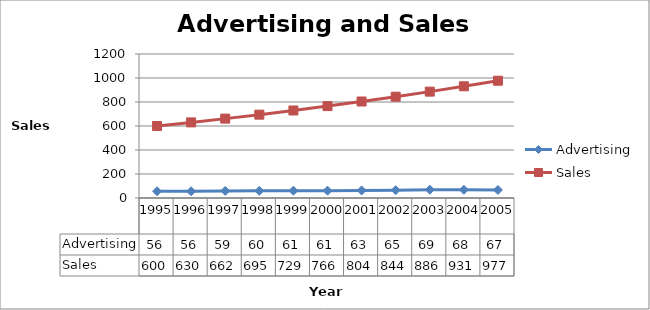
| Category | Advertising | Sales |
|---|---|---|
| 1995.0 | 56 | 600 |
| 1996.0 | 56 | 630 |
| 1997.0 | 59 | 661.5 |
| 1998.0 | 60 | 694.575 |
| 1999.0 | 61 | 729.304 |
| 2000.0 | 61 | 765.769 |
| 2001.0 | 63 | 804.057 |
| 2002.0 | 65 | 844.26 |
| 2003.0 | 69 | 886.473 |
| 2004.0 | 68 | 930.797 |
| 2005.0 | 67 | 977.337 |